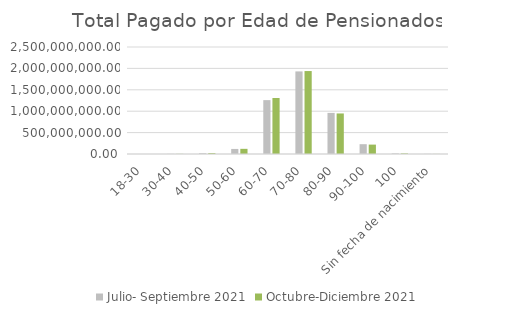
| Category | Julio- Septiembre 2021 | Octubre-Diciembre 2021 |
|---|---|---|
| 18-30 | 218422.05 | 267422.05 |
| 30-40 | 3325981.52 | 3382679.52 |
| 40-50 | 20009093.34 | 20991429.76 |
| 50-60 | 118248151.71 | 120596482.05 |
| 60-70 | 1258662719.05 | 1308301488.61 |
| 70-80 | 1929558341.44 | 1938025601.84 |
| 80-90 | 960599435.4 | 947241481.6 |
| 90-100 | 229201609.84 | 219514634.68 |
| 100 | 14324499.04 | 13782468.1 |
| Sin fecha de nacimiento | 3104600.64 | 1864600.64 |